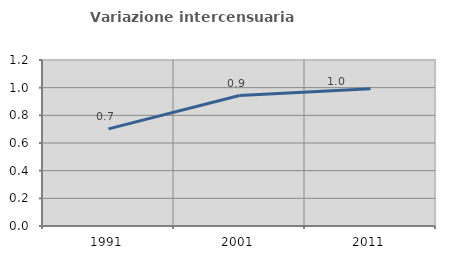
| Category | Variazione intercensuaria annua |
|---|---|
| 1991.0 | 0.702 |
| 2001.0 | 0.943 |
| 2011.0 | 0.992 |